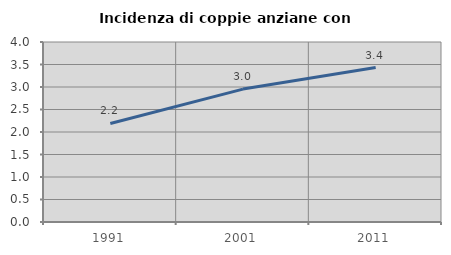
| Category | Incidenza di coppie anziane con figli |
|---|---|
| 1991.0 | 2.189 |
| 2001.0 | 2.954 |
| 2011.0 | 3.431 |